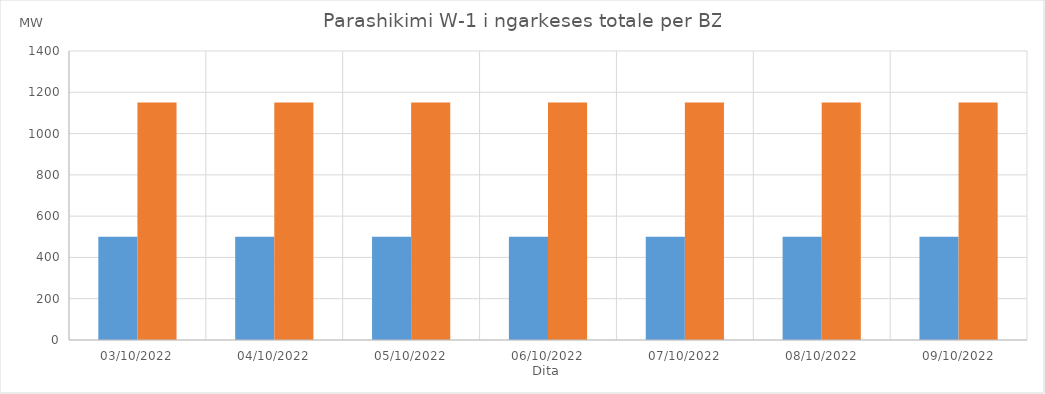
| Category | Min (MW) | Max (MW) |
|---|---|---|
| 03/10/2022 | 500 | 1150 |
| 04/10/2022 | 500 | 1150 |
| 05/10/2022 | 500 | 1150 |
| 06/10/2022 | 500 | 1150 |
| 07/10/2022 | 500 | 1150 |
| 08/10/2022 | 500 | 1150 |
| 09/10/2022 | 500 | 1150 |